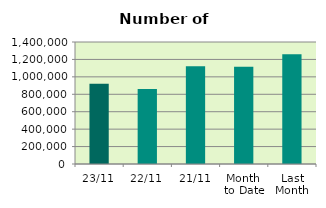
| Category | Series 0 |
|---|---|
| 23/11 | 919766 |
| 22/11 | 860694 |
| 21/11 | 1122836 |
| Month 
to Date | 1116412.353 |
| Last
Month | 1260789.391 |